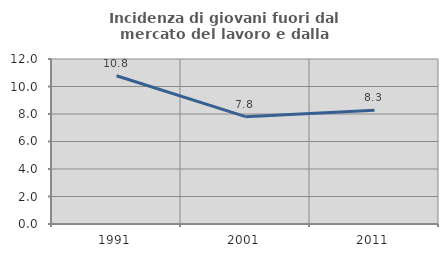
| Category | Incidenza di giovani fuori dal mercato del lavoro e dalla formazione  |
|---|---|
| 1991.0 | 10.784 |
| 2001.0 | 7.809 |
| 2011.0 | 8.276 |